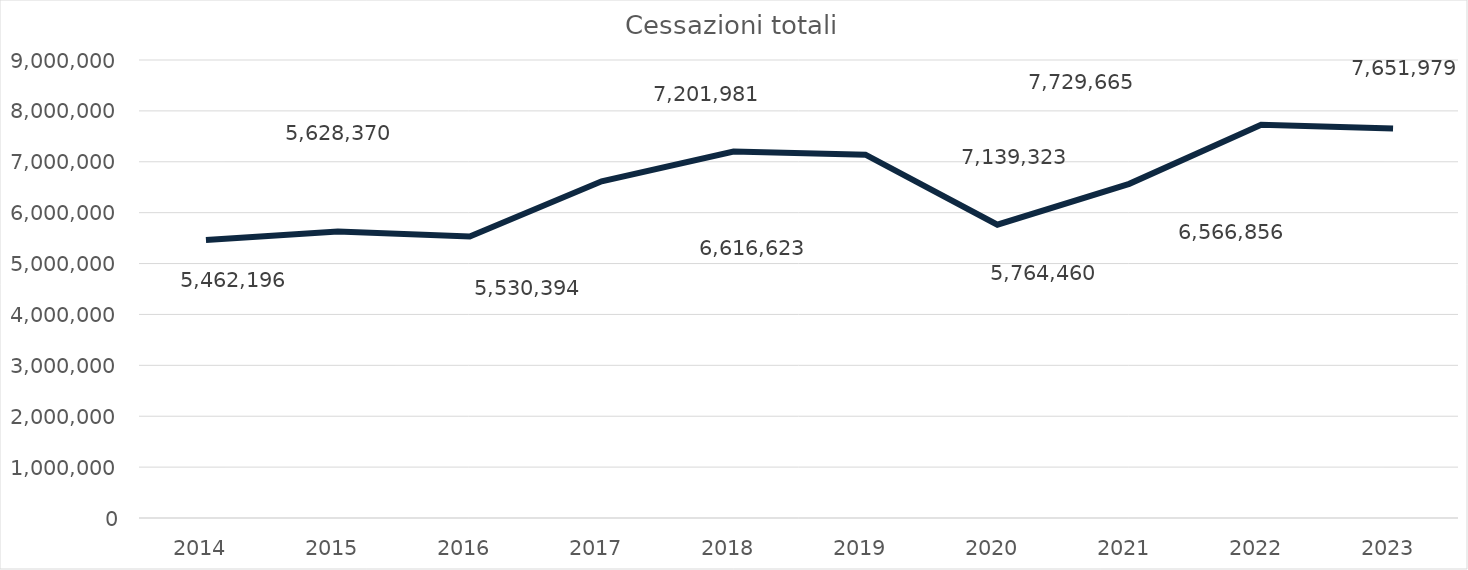
| Category | Cess Totali |
|---|---|
| 2014.0 | 5462196 |
| 2015.0 | 5628370 |
| 2016.0 | 5530394 |
| 2017.0 | 6616623 |
| 2018.0 | 7201981 |
| 2019.0 | 7139323 |
| 2020.0 | 5764460 |
| 2021.0 | 6566856 |
| 2022.0 | 7729665 |
| 2023.0 | 7651979 |